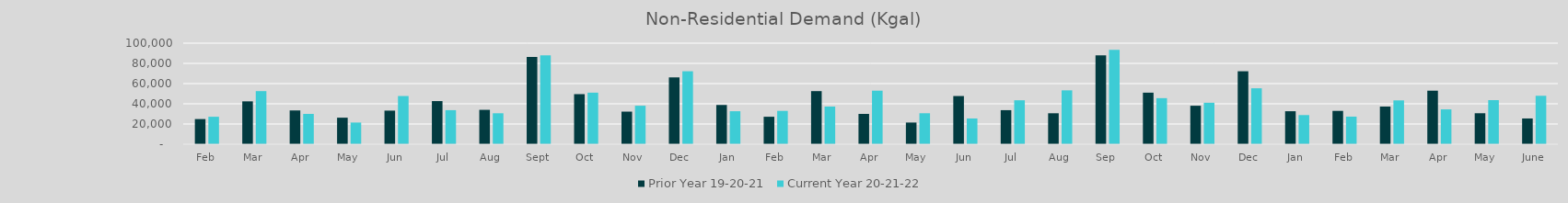
| Category | Prior Year 19-20-21 | Current Year 20-21-22 |
|---|---|---|
| Feb | 24891.705 | 27184.287 |
| Mar | 42416.796 | 52556.784 |
| Apr | 33427.881 | 30008.586 |
| May | 26254.448 | 21459.484 |
| Jun | 33248.873 | 47687.401 |
| Jul | 42679.938 | 33702.696 |
| Aug | 34036.498 | 30630.765 |
| Sep | 86367.775 | 87939.966 |
| Oct | 49561.754 | 51017.647 |
| Nov | 32261.42 | 38090.247 |
| Dec | 66164.871 | 72201.815 |
| Jan | 38851.995 | 32645.301 |
| Feb | 27184.287 | 32987.653 |
| Mar | 52556.784 | 37296.185 |
| Apr | 30008.586 | 52983.593 |
| May | 21459.484 | 30657.737 |
| Jun | 47687.401 | 25485.258 |
| Jul | 33702.696 | 43493.567 |
| Aug | 30630.765 | 53305.831 |
| Sep | 87939.966 | 93442.494 |
| Oct | 51017.647 | 45586.98 |
| Nov | 38090.247 | 41019.482 |
| Dec | 72201.815 | 55350.474 |
| Jan | 32645.301 | 28832.602 |
| Feb | 32987.653 | 27305.762 |
| Mar | 37296.185 | 43384.037 |
| Apr | 52983.593 | 34485.291 |
| May | 30657.737 | 43618.865 |
| June | 25485.258 | 47925.22 |